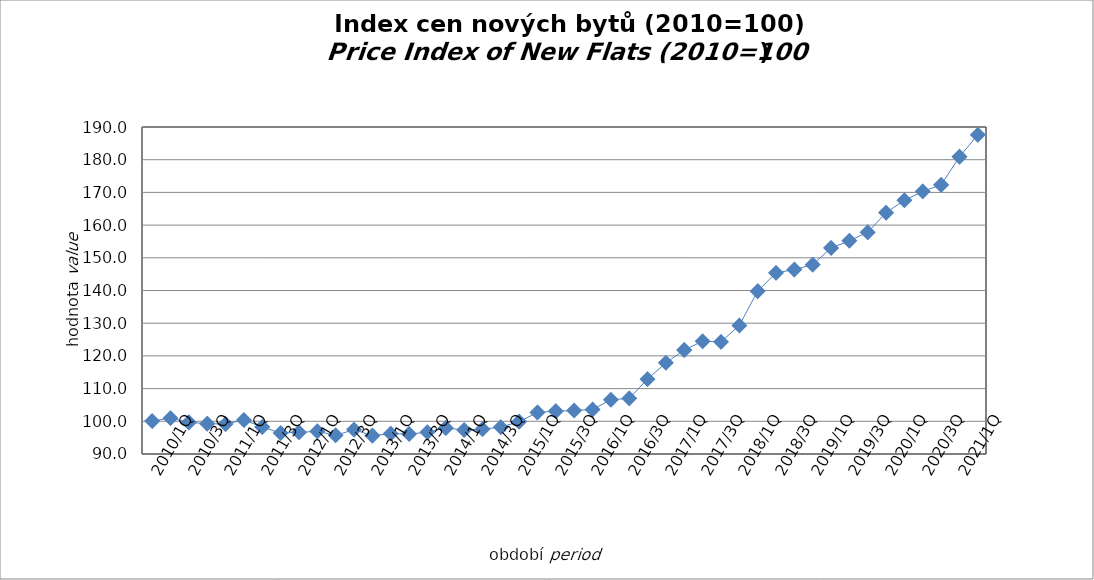
| Category | Series 0 |
|---|---|
| 2010/1Q | 100.076 |
| 2010/2Q | 100.988 |
| 2010/3Q | 99.671 |
| 2010/4Q | 99.266 |
| 2011/1Q | 99.164 |
| 2011/2Q | 100.38 |
| 2011/3Q | 98.253 |
| 2011/4Q | 96.429 |
| 2012/1Q | 96.632 |
| 2012/2Q | 96.936 |
| 2012/3Q | 95.72 |
| 2012/4Q | 97.442 |
| 2013/1Q | 95.619 |
| 2013/2Q | 96.227 |
| 2013/3Q | 96.126 |
| 2013/4Q | 96.632 |
| 2014/1Q | 97.949 |
| 2014/2Q | 97.341 |
| 2014/3Q | 97.6 |
| 2014/4Q | 98.2 |
| 2015/1Q | 99.9 |
| 2015/2Q | 102.7 |
| 2015/3Q | 103.1 |
| 2015/4Q | 103.3 |
| 2016/1Q | 103.6 |
| 2016/2Q | 106.6 |
| 2016/3Q | 107 |
| 2016/4Q | 112.9 |
| 2017/1Q | 117.9 |
| 2017/2Q | 121.8 |
| 2017/3Q | 124.5 |
| 2017/4Q | 124.3 |
| 2018/1Q | 129.3 |
| 2018/2Q | 139.8 |
| 2018/3Q | 145.4 |
| 2018/4Q | 146.4 |
| 2019/1Q | 147.9 |
| 2019/2Q | 153 |
| 2019/3Q | 155.2 |
| 2019/4Q | 157.8 |
| 2020/1Q | 163.8 |
| 2020/2Q | 167.6 |
| 2020/3Q | 170.3 |
| 2020/4Q | 172.3 |
| 2021/1Q | 180.9 |
| 2021/2Q | 187.6 |